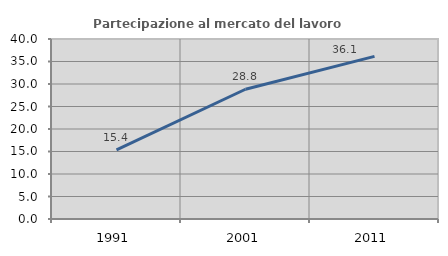
| Category | Partecipazione al mercato del lavoro  femminile |
|---|---|
| 1991.0 | 15.371 |
| 2001.0 | 28.83 |
| 2011.0 | 36.131 |